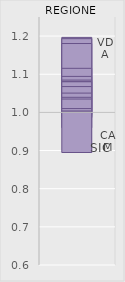
| Category | VDA | BZ | TN | BAS | MOL | PIE | TOS | LIG | VEN | ERO | LOM | FVG | UMB | MAR | CAM | ABR | CAL | SAR | PUG | LAZ | SIC |
|---|---|---|---|---|---|---|---|---|---|---|---|---|---|---|---|---|---|---|---|---|---|
|  | 1.197 | 1.193 | 1.18 | 1.115 | 1.094 | 1.085 | 1.081 | 1.08 | 1.068 | 1.051 | 1.04 | 1.035 | 1.01 | 1.004 | 1 | 0.996 | 0.995 | 0.991 | 0.988 | 0.961 | 0.896 |